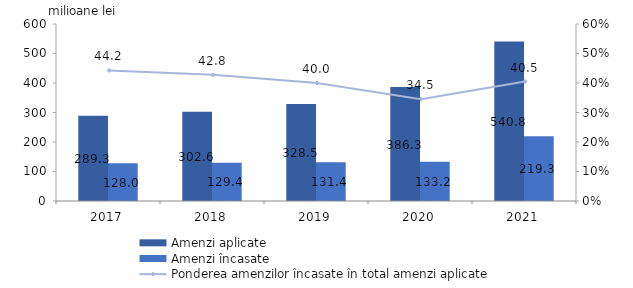
| Category | Amenzi aplicate | Amenzi încasate |
|---|---|---|
| 2017.0 | 289.3 | 128 |
| 2018.0 | 302.6 | 129.4 |
| 2019.0 | 328.5 | 131.4 |
| 2020.0 | 386.3 | 133.2 |
| 2021.0 | 540.8 | 219.3 |